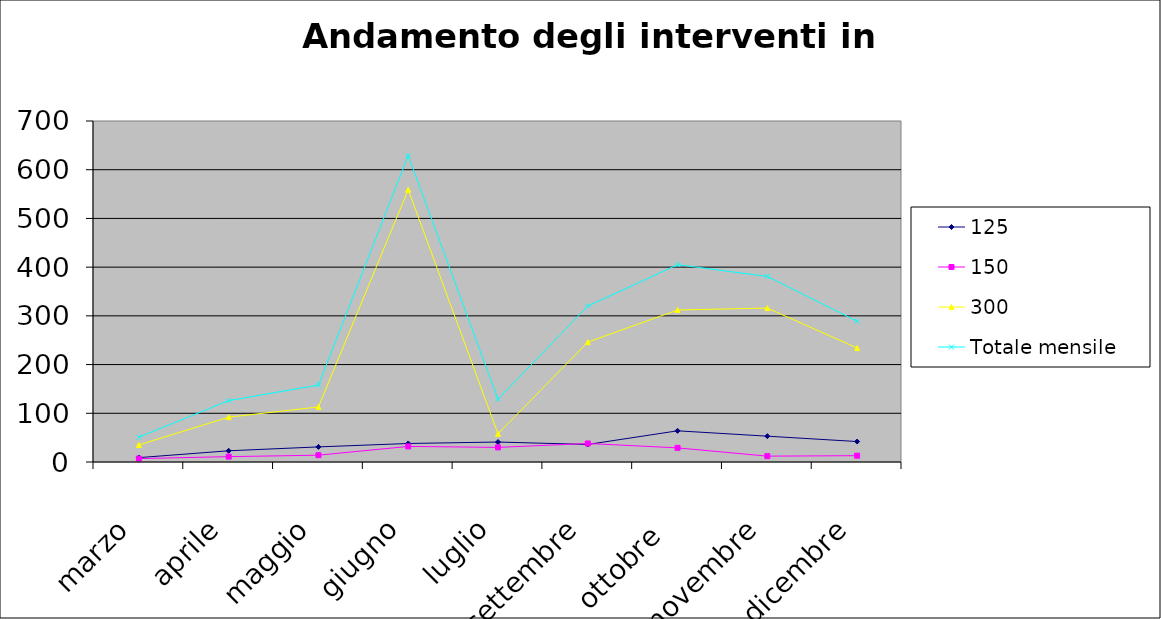
| Category | 125 | 150 | 300 | Totale mensile |
|---|---|---|---|---|
| marzo | 9 | 7 | 35 | 51 |
| aprile | 23 | 11 | 92 | 126 |
| maggio | 31 | 14 | 113 | 158 |
| giugno | 38 | 32 | 559 | 629 |
| luglio | 41 | 30 | 58 | 129 |
| settembre | 36 | 38 | 246 | 320 |
| ottobre  | 64 | 29 | 312 | 405 |
| novembre | 53 | 12 | 316 | 381 |
| dicembre | 42 | 13 | 234 | 289 |